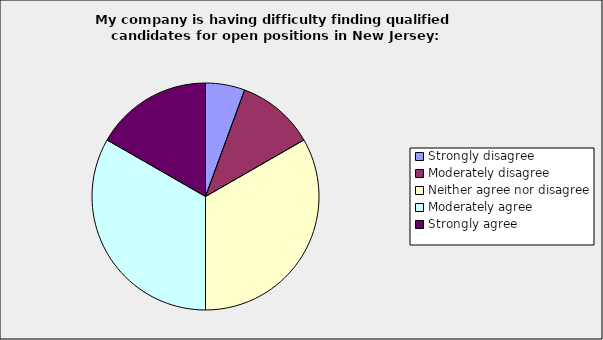
| Category | Series 0 |
|---|---|
| Strongly disagree | 0.056 |
| Moderately disagree | 0.111 |
| Neither agree nor disagree | 0.333 |
| Moderately agree | 0.333 |
| Strongly agree | 0.167 |